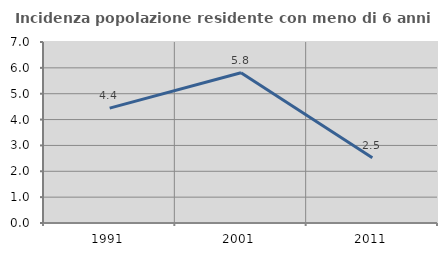
| Category | Incidenza popolazione residente con meno di 6 anni |
|---|---|
| 1991.0 | 4.442 |
| 2001.0 | 5.808 |
| 2011.0 | 2.519 |